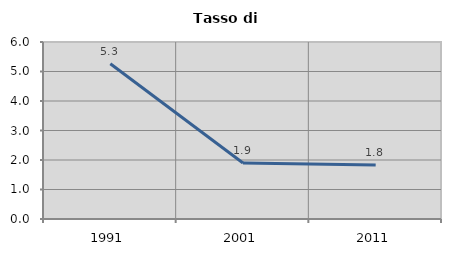
| Category | Tasso di disoccupazione   |
|---|---|
| 1991.0 | 5.263 |
| 2001.0 | 1.899 |
| 2011.0 | 1.829 |